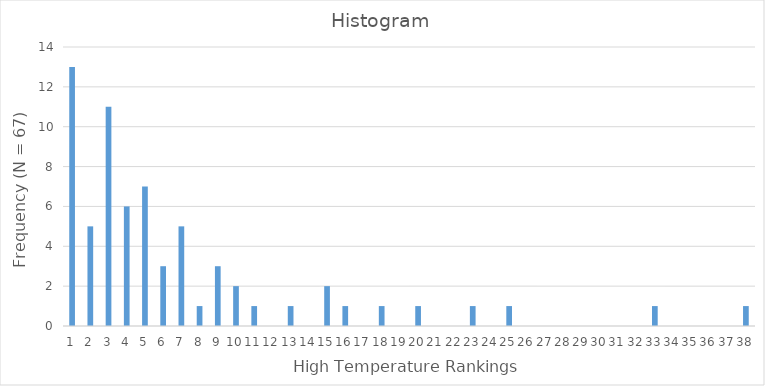
| Category | Frequency |
|---|---|
| 0 | 13 |
| 1 | 5 |
| 2 | 11 |
| 3 | 6 |
| 4 | 7 |
| 5 | 3 |
| 6 | 5 |
| 7 | 1 |
| 8 | 3 |
| 9 | 2 |
| 10 | 1 |
| 11 | 0 |
| 12 | 1 |
| 13 | 0 |
| 14 | 2 |
| 15 | 1 |
| 16 | 0 |
| 17 | 1 |
| 18 | 0 |
| 19 | 1 |
| 20 | 0 |
| 21 | 0 |
| 22 | 1 |
| 23 | 0 |
| 24 | 1 |
| 25 | 0 |
| 26 | 0 |
| 27 | 0 |
| 28 | 0 |
| 29 | 0 |
| 30 | 0 |
| 31 | 0 |
| 32 | 1 |
| 33 | 0 |
| 34 | 0 |
| 35 | 0 |
| 36 | 0 |
| 37 | 1 |